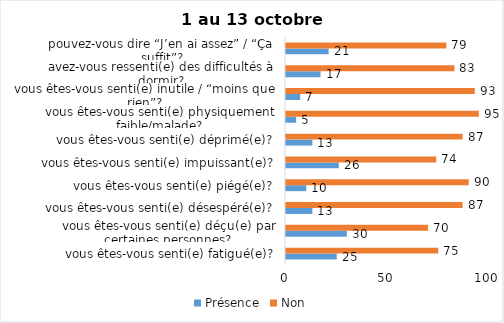
| Category | Présence | Non |
|---|---|---|
| vous êtes-vous senti(e) fatigué(e)? | 25 | 75 |
| vous êtes-vous senti(e) déçu(e) par certaines personnes? | 30 | 70 |
| vous êtes-vous senti(e) désespéré(e)? | 13 | 87 |
| vous êtes-vous senti(e) piégé(e)? | 10 | 90 |
| vous êtes-vous senti(e) impuissant(e)? | 26 | 74 |
| vous êtes-vous senti(e) déprimé(e)? | 13 | 87 |
| vous êtes-vous senti(e) physiquement faible/malade? | 5 | 95 |
| vous êtes-vous senti(e) inutile / “moins que rien”? | 7 | 93 |
| avez-vous ressenti(e) des difficultés à dormir? | 17 | 83 |
| pouvez-vous dire “J’en ai assez” / “Ça suffit”? | 21 | 79 |